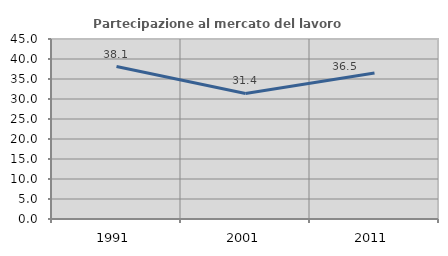
| Category | Partecipazione al mercato del lavoro  femminile |
|---|---|
| 1991.0 | 38.117 |
| 2001.0 | 31.375 |
| 2011.0 | 36.488 |